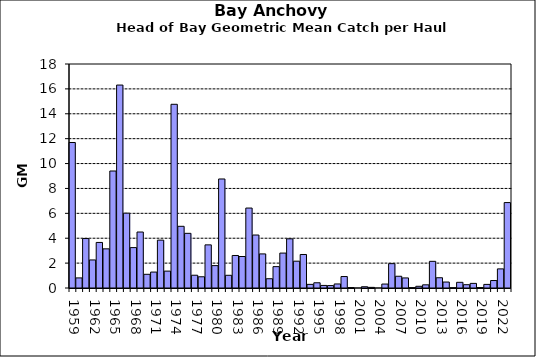
| Category | Series 0 |
|---|---|
| 1959.0 | 11.691 |
| 1960.0 | 0.81 |
| 1961.0 | 3.975 |
| 1962.0 | 2.254 |
| 1963.0 | 3.661 |
| 1964.0 | 3.147 |
| 1965.0 | 9.401 |
| 1966.0 | 16.308 |
| 1967.0 | 6.014 |
| 1968.0 | 3.246 |
| 1969.0 | 4.498 |
| 1970.0 | 1.101 |
| 1971.0 | 1.28 |
| 1972.0 | 3.846 |
| 1973.0 | 1.356 |
| 1974.0 | 14.762 |
| 1975.0 | 4.958 |
| 1976.0 | 4.393 |
| 1977.0 | 1.027 |
| 1978.0 | 0.902 |
| 1979.0 | 3.466 |
| 1980.0 | 1.798 |
| 1981.0 | 8.761 |
| 1982.0 | 1.021 |
| 1983.0 | 2.612 |
| 1984.0 | 2.531 |
| 1985.0 | 6.424 |
| 1986.0 | 4.257 |
| 1987.0 | 2.739 |
| 1988.0 | 0.746 |
| 1989.0 | 1.718 |
| 1990.0 | 2.805 |
| 1991.0 | 3.95 |
| 1992.0 | 2.155 |
| 1993.0 | 2.692 |
| 1994.0 | 0.292 |
| 1995.0 | 0.42 |
| 1996.0 | 0.207 |
| 1997.0 | 0.195 |
| 1998.0 | 0.324 |
| 1999.0 | 0.921 |
| 2000.0 | 0.034 |
| 2001.0 | 0 |
| 2002.0 | 0.101 |
| 2003.0 | 0.051 |
| 2004.0 | 0 |
| 2005.0 | 0.318 |
| 2006.0 | 1.957 |
| 2007.0 | 0.943 |
| 2008.0 | 0.81 |
| 2009.0 | 0.027 |
| 2010.0 | 0.138 |
| 2011.0 | 0.255 |
| 2012.0 | 2.143 |
| 2013.0 | 0.825 |
| 2014.0 | 0.479 |
| 2015.0 | 0.017 |
| 2016.0 | 0.456 |
| 2017.0 | 0.265 |
| 2018.0 | 0.371 |
| 2019.0 | 0.034 |
| 2020.0 | 0.29 |
| 2021.0 | 0.601 |
| 2022.0 | 1.536 |
| 2023.0 | 6.865 |